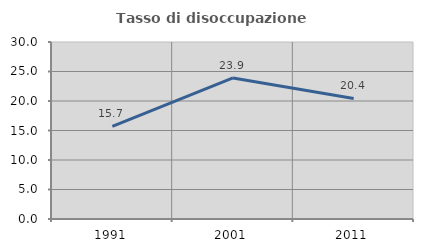
| Category | Tasso di disoccupazione giovanile  |
|---|---|
| 1991.0 | 15.714 |
| 2001.0 | 23.913 |
| 2011.0 | 20.43 |